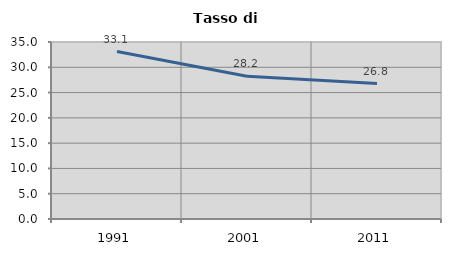
| Category | Tasso di disoccupazione   |
|---|---|
| 1991.0 | 33.121 |
| 2001.0 | 28.244 |
| 2011.0 | 26.786 |